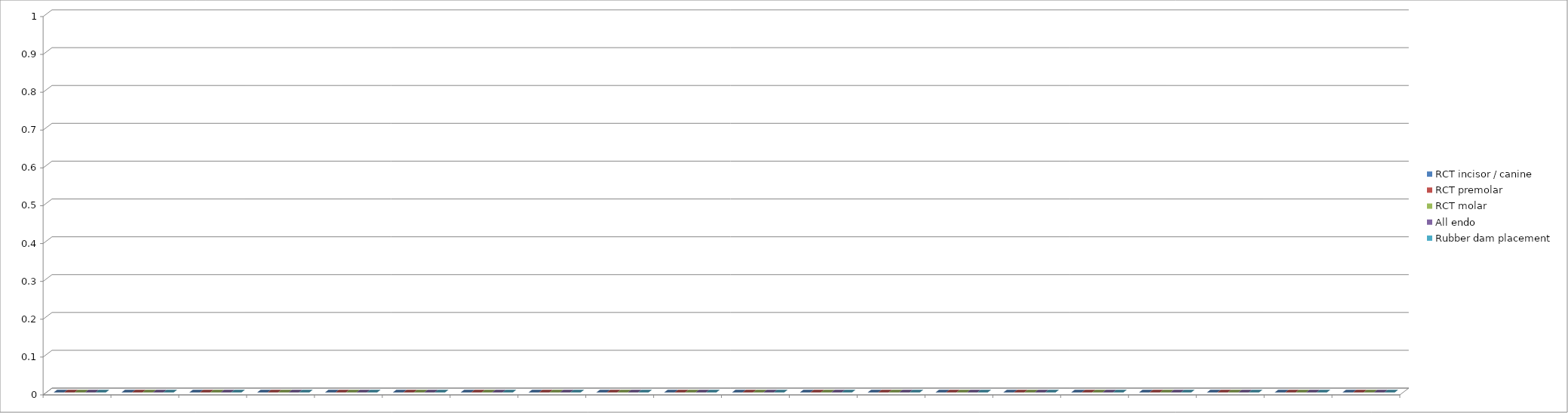
| Category | RCT incisor / canine | RCT premolar | RCT molar | All endo | Rubber dam placement |
|---|---|---|---|---|---|
| 0 | 0 | 0 | 0 | 0 | 0 |
| 1 | 0 | 0 | 0 | 0 | 0 |
| 2 | 0 | 0 | 0 | 0 | 0 |
| 3 | 0 | 0 | 0 | 0 | 0 |
| 4 | 0 | 0 | 0 | 0 | 0 |
| 5 | 0 | 0 | 0 | 0 | 0 |
| 6 | 0 | 0 | 0 | 0 | 0 |
| 7 | 0 | 0 | 0 | 0 | 0 |
| 8 | 0 | 0 | 0 | 0 | 0 |
| 9 | 0 | 0 | 0 | 0 | 0 |
| 10 | 0 | 0 | 0 | 0 | 0 |
| 11 | 0 | 0 | 0 | 0 | 0 |
| 12 | 0 | 0 | 0 | 0 | 0 |
| 13 | 0 | 0 | 0 | 0 | 0 |
| 14 | 0 | 0 | 0 | 0 | 0 |
| 15 | 0 | 0 | 0 | 0 | 0 |
| 16 | 0 | 0 | 0 | 0 | 0 |
| 17 | 0 | 0 | 0 | 0 | 0 |
| 18 | 0 | 0 | 0 | 0 | 0 |
| 19 | 0 | 0 | 0 | 0 | 0 |